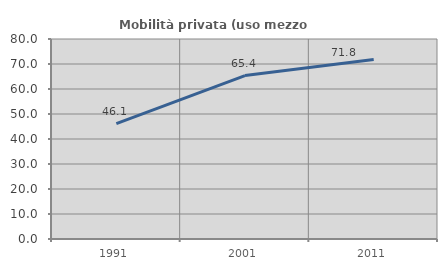
| Category | Mobilità privata (uso mezzo privato) |
|---|---|
| 1991.0 | 46.127 |
| 2001.0 | 65.368 |
| 2011.0 | 71.824 |